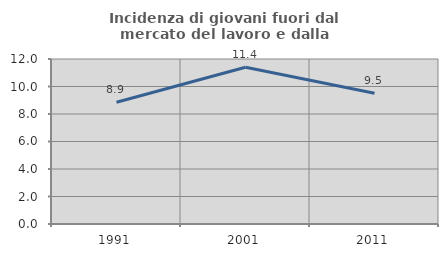
| Category | Incidenza di giovani fuori dal mercato del lavoro e dalla formazione  |
|---|---|
| 1991.0 | 8.854 |
| 2001.0 | 11.404 |
| 2011.0 | 9.515 |